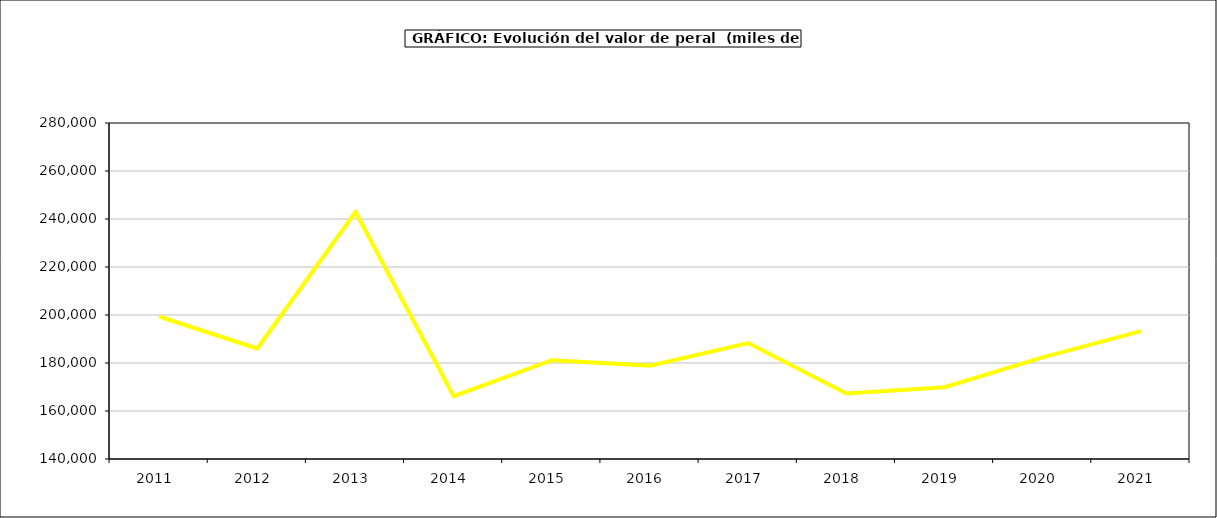
| Category | valor peral |
|---|---|
| 2011.0 | 199365.811 |
| 2012.0 | 186031.625 |
| 2013.0 | 242867.092 |
| 2014.0 | 166145.606 |
| 2015.0 | 181166 |
| 2016.0 | 178909 |
| 2017.0 | 188326.979 |
| 2018.0 | 167289.385 |
| 2019.0 | 169898.246 |
| 2020.0 | 182329.972 |
| 2021.0 | 193294.489 |